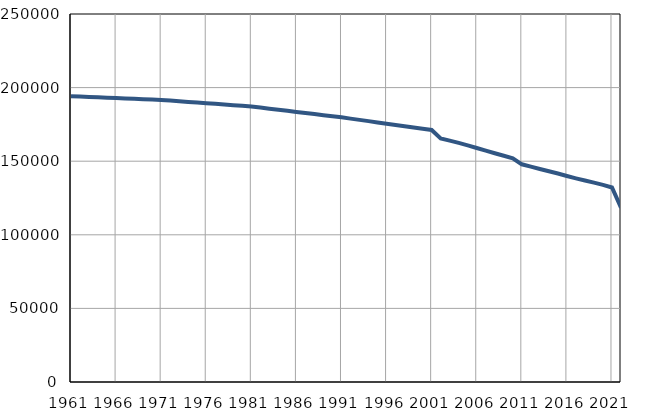
| Category | Population
size |
|---|---|
| 1961.0 | 194150 |
| 1962.0 | 193898 |
| 1963.0 | 193646 |
| 1964.0 | 193395 |
| 1965.0 | 193143 |
| 1966.0 | 192891 |
| 1967.0 | 192639 |
| 1968.0 | 192387 |
| 1969.0 | 192136 |
| 1970.0 | 191884 |
| 1971.0 | 191632 |
| 1972.0 | 191187 |
| 1973.0 | 190741 |
| 1974.0 | 190296 |
| 1975.0 | 189851 |
| 1976.0 | 189406 |
| 1977.0 | 188960 |
| 1978.0 | 188515 |
| 1979.0 | 188070 |
| 1980.0 | 187624 |
| 1981.0 | 187179 |
| 1982.0 | 186439 |
| 1983.0 | 185700 |
| 1984.0 | 184960 |
| 1985.0 | 184221 |
| 1986.0 | 183481 |
| 1987.0 | 182741 |
| 1988.0 | 182002 |
| 1989.0 | 181262 |
| 1990.0 | 180523 |
| 1991.0 | 179783 |
| 1992.0 | 178926 |
| 1993.0 | 178070 |
| 1994.0 | 177213 |
| 1995.0 | 176357 |
| 1996.0 | 175500 |
| 1997.0 | 174644 |
| 1998.0 | 173788 |
| 1999.0 | 172931 |
| 2000.0 | 172074 |
| 2001.0 | 171218 |
| 2002.0 | 165513 |
| 2003.0 | 164013 |
| 2004.0 | 162435 |
| 2005.0 | 160757 |
| 2006.0 | 158984 |
| 2007.0 | 157155 |
| 2008.0 | 155387 |
| 2009.0 | 153708 |
| 2010.0 | 151982 |
| 2011.0 | 147890 |
| 2012.0 | 146274 |
| 2013.0 | 144672 |
| 2014.0 | 143144 |
| 2015.0 | 141612 |
| 2016.0 | 139940 |
| 2017.0 | 138371 |
| 2018.0 | 136918 |
| 2019.0 | 135453 |
| 2020.0 | 133934 |
| 2021.0 | 132117 |
| 2022.0 | 118421 |